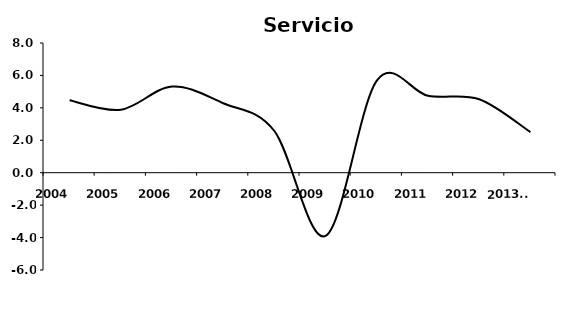
| Category | Servicios |
|---|---|
| 2004 | 4.467 |
| 2005 | 3.883 |
| 2006 | 5.314 |
| 2007 | 4.286 |
| 2008 | 2.572 |
| 2009 | -3.901 |
| 2010 | 5.675 |
| 2011 | 4.745 |
| 2012 | 4.533 |
| 2013/P | 2.508 |